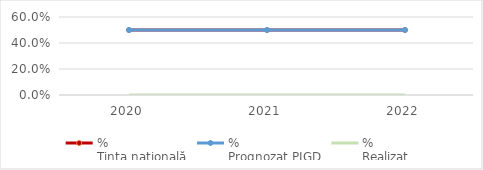
| Category | %
Ținta națională | % 
Prognozat PJGD | % 
Realizat |
|---|---|---|---|
| 2020.0 | 0.5 | 0.5 | 0 |
| 2021.0 | 0.5 | 0.5 | 0 |
| 2022.0 | 0.5 | 0.5 | 0 |